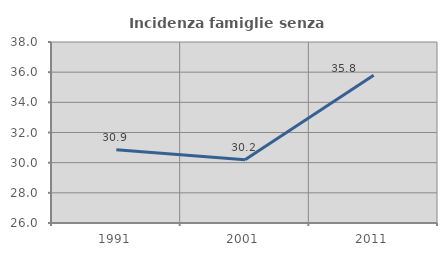
| Category | Incidenza famiglie senza nuclei |
|---|---|
| 1991.0 | 30.855 |
| 2001.0 | 30.196 |
| 2011.0 | 35.793 |